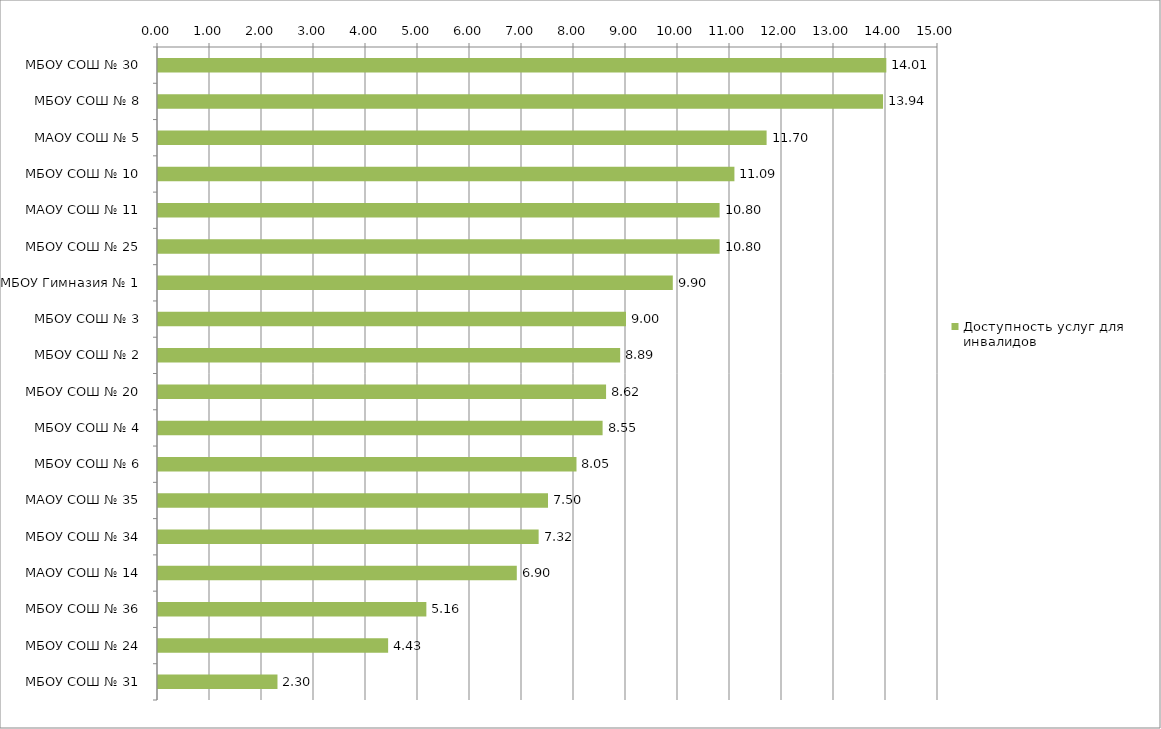
| Category | Доступность услуг для инвалидов |
|---|---|
| МБОУ СОШ № 30 | 14.006 |
| МБОУ СОШ № 8 | 13.943 |
| МАОУ СОШ № 5 | 11.704 |
| МБОУ СОШ № 10 | 11.085 |
| МАОУ СОШ № 11 | 10.8 |
| МБОУ СОШ № 25 | 10.8 |
| МБОУ Гимназия № 1 | 9.9 |
| МБОУ СОШ № 3 | 9 |
| МБОУ СОШ № 2 | 8.888 |
| МБОУ СОШ № 20 | 8.617 |
| МБОУ СОШ № 4 | 8.55 |
| МБОУ СОШ № 6 | 8.048 |
| МАОУ СОШ № 35 | 7.5 |
| МБОУ СОШ № 34 | 7.32 |
| МАОУ СОШ № 14 | 6.9 |
| МБОУ СОШ № 36 | 5.161 |
| МБОУ СОШ № 24 | 4.426 |
| МБОУ СОШ № 31 | 2.298 |